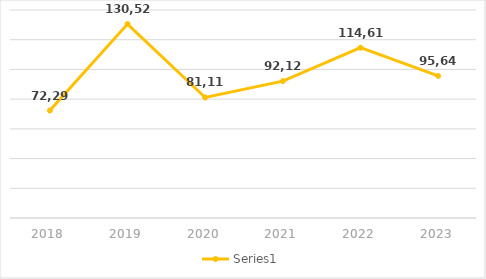
| Category | Series 0 |
|---|---|
| 2018 | 72299 |
| 2019 | 130528 |
| 2020 | 81117 |
| 2021 | 92125 |
| 2022 | 114619 |
| 2023 | 95641 |